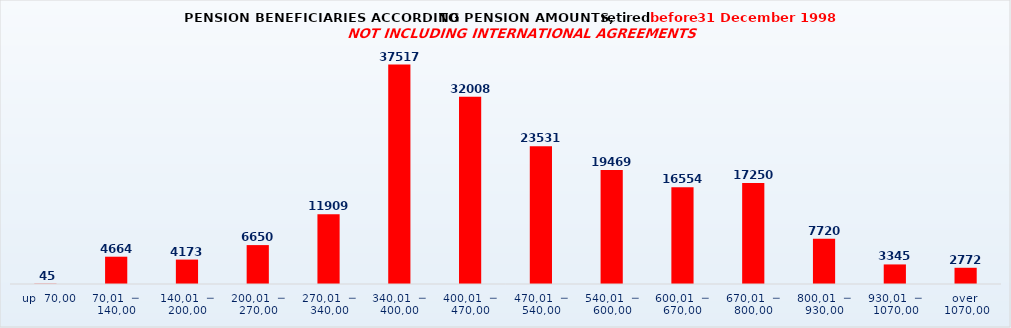
| Category | Series 0 |
|---|---|
|   up  70,00 | 45 |
| 70,01  ─  140,00 | 4664 |
| 140,01  ─  200,00 | 4173 |
| 200,01  ─  270,00 | 6650 |
| 270,01  ─  340,00 | 11909 |
| 340,01  ─  400,00 | 37517 |
| 400,01  ─  470,00 | 32008 |
| 470,01  ─  540,00 | 23531 |
| 540,01  ─  600,00 | 19469 |
| 600,01  ─  670,00 | 16554 |
| 670,01  ─  800,00 | 17250 |
| 800,01  ─  930,00 | 7720 |
| 930,01  ─  1070,00 | 3345 |
| over  1070,00 | 2772 |